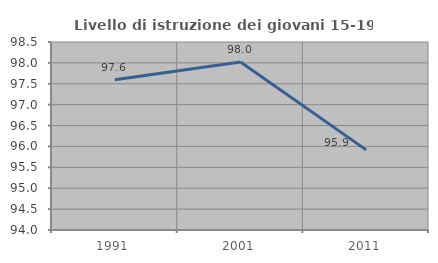
| Category | Livello di istruzione dei giovani 15-19 anni |
|---|---|
| 1991.0 | 97.595 |
| 2001.0 | 98.024 |
| 2011.0 | 95.918 |